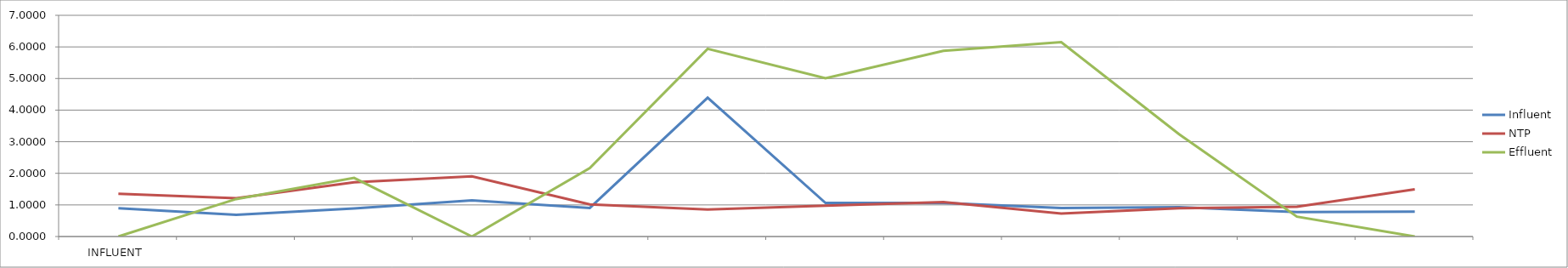
| Category | Influent | NTP | Effluent |
|---|---|---|---|
| 0 | 0.894 | 1.356 | 0 |
| 1 | 0.686 | 1.212 | 1.187 |
| 2 | 0.886 | 1.718 | 1.854 |
| 3 | 1.144 | 1.906 | 0 |
| 4 | 0.905 | 1.016 | 2.166 |
| 5 | 4.392 | 0.856 | 5.94 |
| 6 | 1.063 | 0.978 | 5.007 |
| 7 | 1.064 | 1.092 | 5.878 |
| 8 | 0.899 | 0.726 | 6.15 |
| 9 | 0.932 | 0.897 | 3.238 |
| 10 | 0.775 | 0.942 | 0.63 |
| 11 | 0.788 | 1.496 | 0 |